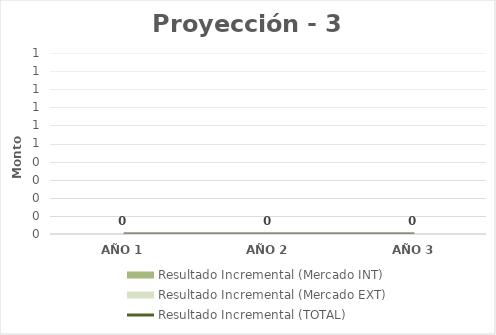
| Category | Resultado Incremental (Mercado INT) | Resultado Incremental (Mercado EXT) |
|---|---|---|
| AÑO 1 | 0 | 0 |
| AÑO 2 | 0 | 0 |
| AÑO 3 | 0 | 0 |